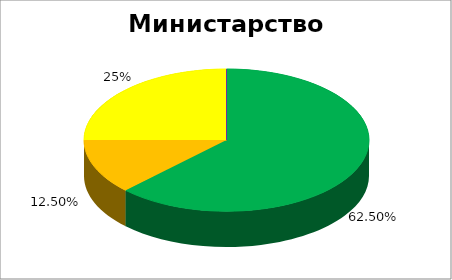
| Category | Министарство правде  |
|---|---|
| 0 | 0.625 |
| 1 | 0.125 |
| 2 | 0.25 |
| 3 | 0 |
| 4 | 0 |